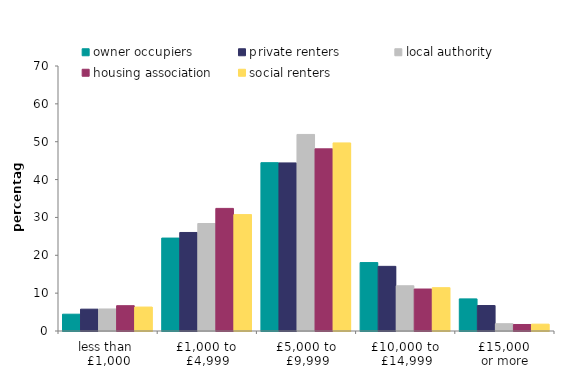
| Category | owner occupiers | private renters | local authority | housing association | social renters |
|---|---|---|---|---|---|
| less than 
£1,000 | 4.438 | 5.769 | 5.816 | 6.684 | 6.327 |
| £1,000 to 
£4,999 | 24.546 | 26.025 | 28.39 | 32.385 | 30.741 |
| £5,000 to 
£9,999 | 44.462 | 44.398 | 51.918 | 48.121 | 49.684 |
| £10,000 to 
£14,999 | 18.074 | 17.078 | 11.949 | 11.089 | 11.443 |
| £15,000 
or more | 8.481 | 6.73 | 1.927 | 1.721 | 1.806 |